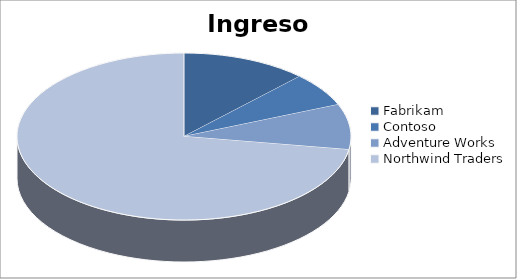
| Category | Ingresos |
|---|---|
| Fabrikam | 2964370 |
| Contoso | 1592370 |
| Adventure Works | 2130101 |
| Northwind Traders | 17611434 |